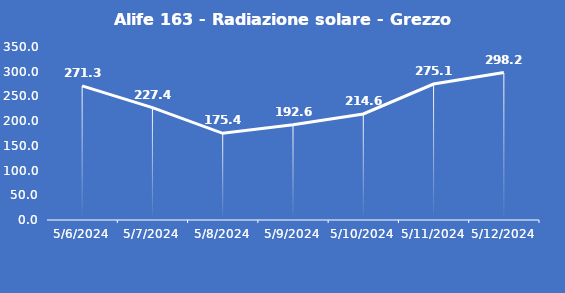
| Category | Alife 163 - Radiazione solare - Grezzo (W/m2) |
|---|---|
| 5/6/24 | 271.3 |
| 5/7/24 | 227.4 |
| 5/8/24 | 175.4 |
| 5/9/24 | 192.6 |
| 5/10/24 | 214.6 |
| 5/11/24 | 275.1 |
| 5/12/24 | 298.2 |